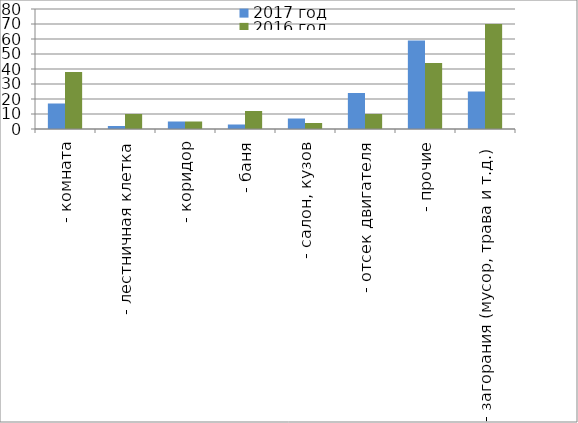
| Category | 2017 год | 2016 год |
|---|---|---|
|  - комната | 17 | 38 |
|  - лестничная клетка | 2 | 10 |
|  - коридор | 5 | 5 |
|  - баня | 3 | 12 |
|  - салон, кузов | 7 | 4 |
|  - отсек двигателя | 24 | 10 |
| - прочие | 59 | 44 |
| - загорания (мусор, трава и т.д.)  | 25 | 70 |